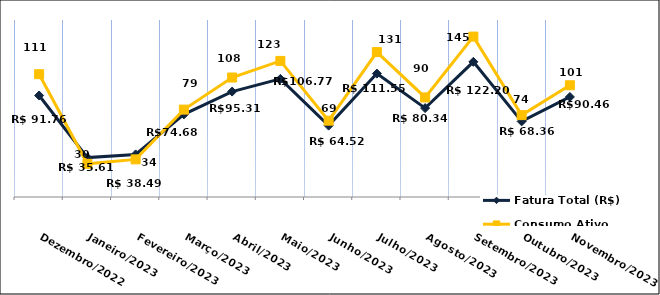
| Category | Fatura Total (R$) |
|---|---|
| Dezembro/2022 | 91.76 |
| Janeiro/2023 | 35.61 |
| Fevereiro/2023 | 38.49 |
| Março/2023 | 74.68 |
| Abril/2023 | 95.31 |
| Maio/2023 | 106.77 |
| Junho/2023 | 64.52 |
| Julho/2023 | 111.55 |
| Agosto/2023 | 80.34 |
| Setembro/2023 | 122.2 |
| Outubro/2023 | 68.36 |
| Novembro/2023 | 90.46 |